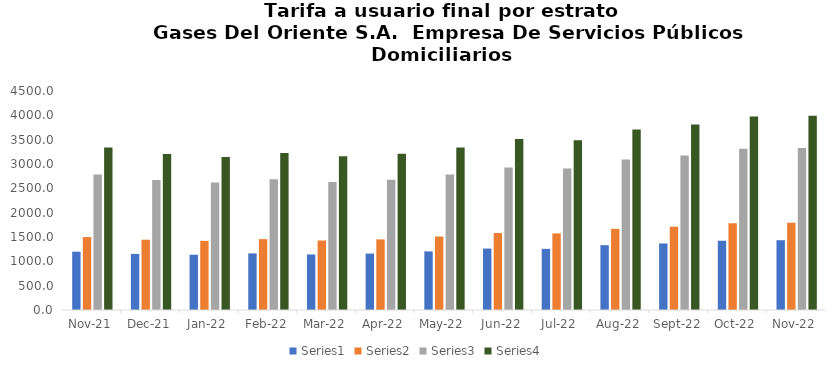
| Category | Series 0 | Series 1 | Series 2 | Series 3 |
|---|---|---|---|---|
| 2021-11-01 | 1198.31 | 1499.77 | 2782.74 | 3339.288 |
| 2021-12-01 | 1152.94 | 1444.18 | 2669.52 | 3203.424 |
| 2022-01-01 | 1135.52 | 1421.55 | 2620.4 | 3144.48 |
| 2022-02-01 | 1162.74 | 1456.54 | 2688.25 | 3225.9 |
| 2022-03-01 | 1141.46 | 1427.8 | 2631.42 | 3157.704 |
| 2022-04-01 | 1158.72 | 1451.12 | 2676.82 | 3212.184 |
| 2022-05-01 | 1204.73 | 1510.34 | 2784.06 | 3340.872 |
| 2022-06-01 | 1262.94 | 1581.51 | 2927.04 | 3512.448 |
| 2022-07-01 | 1256.88 | 1573.21 | 2908.56 | 3490.272 |
| 2022-08-01 | 1331.73 | 1667.06 | 3090.43 | 3708.516 |
| 2022-09-01 | 1367.51 | 1711.63 | 3176.14 | 3811.368 |
| 2022-10-01 | 1423.49 | 1781.6 | 3315.35 | 3978.42 |
| 2022-11-01 | 1433.79 | 1794.38 | 3327.1 | 3992.52 |